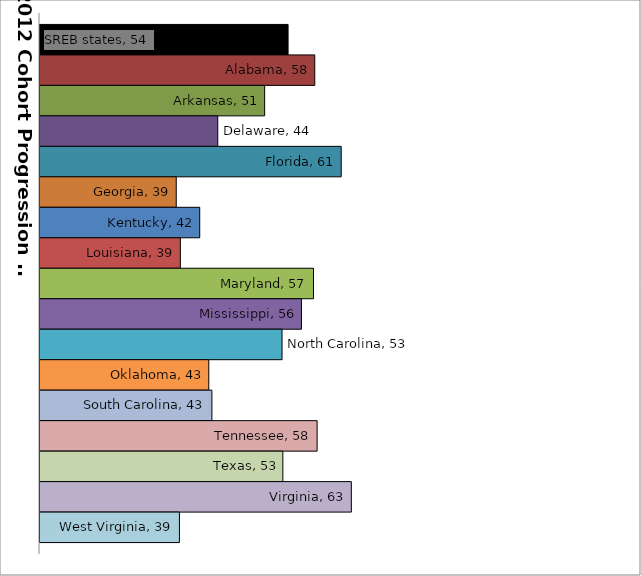
| Category | SREB states | Alabama | Arkansas | Delaware | Florida | Georgia | Kentucky | Louisiana | Maryland | Mississippi | North Carolina | Oklahoma | South Carolina | Tennessee | Texas | Virginia | West Virginia |
|---|---|---|---|---|---|---|---|---|---|---|---|---|---|---|---|---|---|
| 0 | 53.867 | 57.511 | 50.671 | 44.268 | 61.119 | 38.599 | 41.805 | 39.158 | 57.335 | 55.69 | 53.044 | 43.042 | 43.467 | 57.833 | 53.156 | 62.503 | 39.034 |